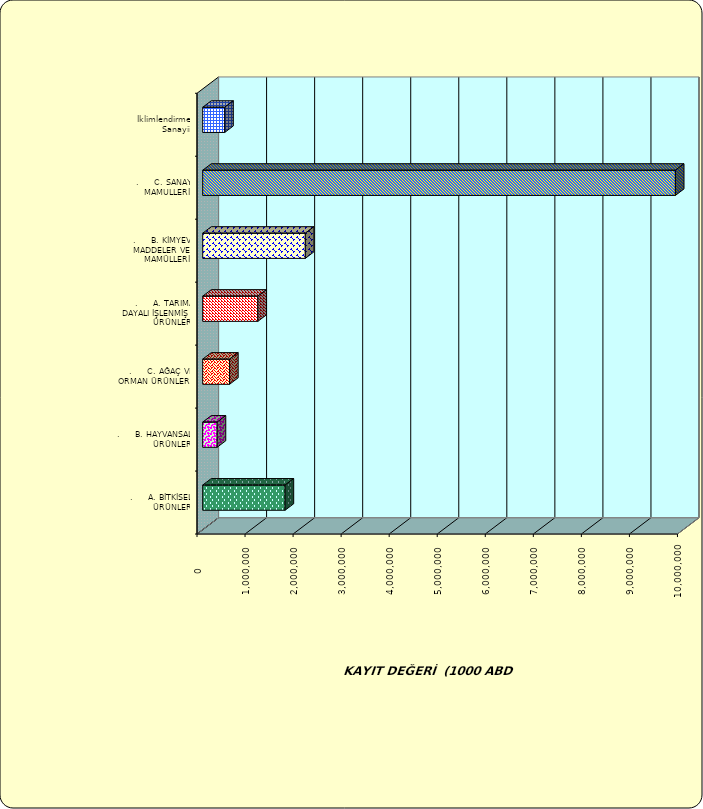
| Category | Series 0 |
|---|---|
| .     A. BİTKİSEL ÜRÜNLER | 1714669.801 |
| .     B. HAYVANSAL ÜRÜNLER | 301015.833 |
| .     C. AĞAÇ VE ORMAN ÜRÜNLERİ | 559231.254 |
| .     A. TARIMA DAYALI İŞLENMİŞ ÜRÜNLER | 1148390.541 |
| .     B. KİMYEVİ MADDELER VE MAMÜLLERİ | 2135682.802 |
| .     C. SANAYİ MAMULLERİ | 9838484.731 |
|  İklimlendirme Sanayii | 458579.59 |